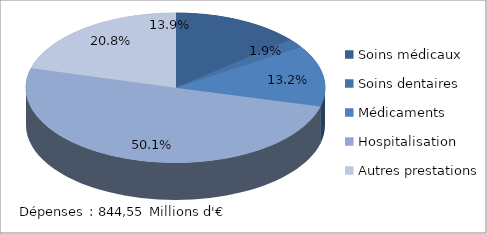
| Category | Series 0 |
|---|---|
| Soins médicaux | 117070199.87 |
| Soins dentaires | 16445410.89 |
| Médicaments | 111671402.66 |
| Hospitalisation | 423533823.39 |
| Autres prestations | 175815707.98 |